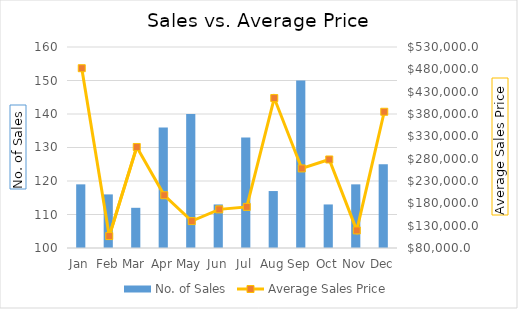
| Category | No. of Sales |
|---|---|
| Jan | 119 |
| Feb | 116 |
| Mar | 112 |
| Apr | 136 |
| May | 140 |
| Jun | 113 |
| Jul | 133 |
| Aug | 117 |
| Sep | 150 |
| Oct | 113 |
| Nov | 119 |
| Dec | 125 |